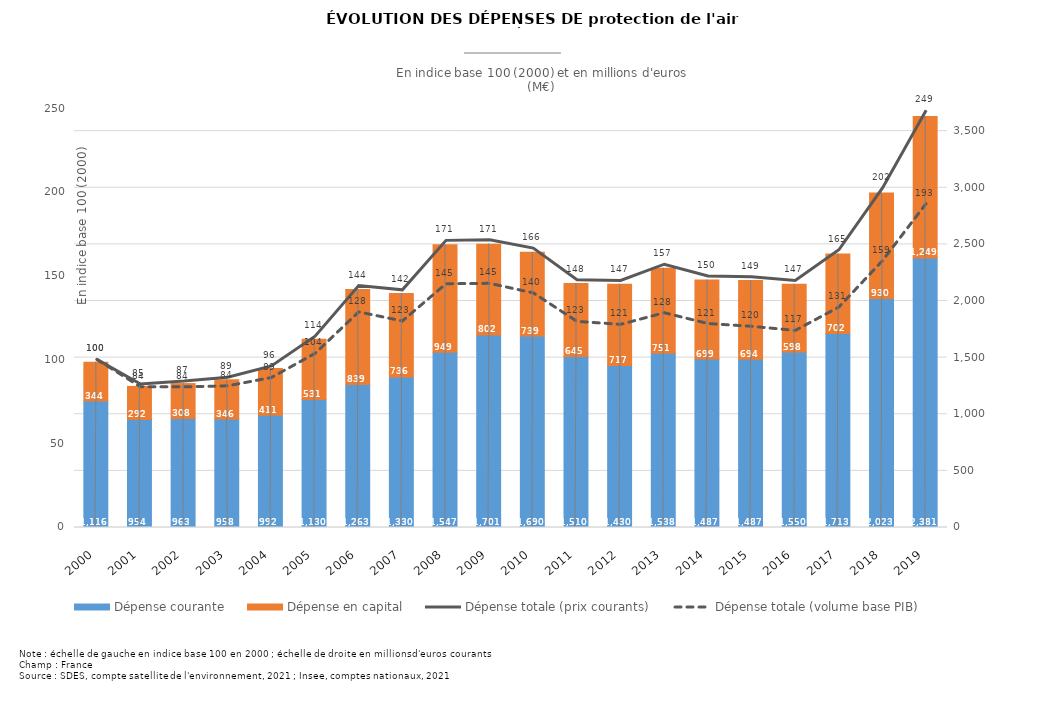
| Category | Dépense courante | Dépense en capital |
|---|---|---|
| 2000.0 | 1116.167 | 343.568 |
| 2001.0 | 953.949 | 292.072 |
| 2002.0 | 962.903 | 307.868 |
| 2003.0 | 957.936 | 346.267 |
| 2004.0 | 991.84 | 411.325 |
| 2005.0 | 1129.923 | 531.492 |
| 2006.0 | 1263.179 | 839.335 |
| 2007.0 | 1329.946 | 735.64 |
| 2008.0 | 1547.477 | 948.93 |
| 2009.0 | 1700.567 | 801.599 |
| 2010.0 | 1690.347 | 739.186 |
| 2011.0 | 1509.849 | 644.577 |
| 2012.0 | 1430.475 | 717.308 |
| 2013.0 | 1537.844 | 750.956 |
| 2014.0 | 1486.861 | 698.937 |
| 2015.0 | 1486.797 | 693.811 |
| 2016.0 | 1549.62 | 597.6 |
| 2017.0 | 1712.78 | 701.882 |
| 2018.0 | 2023.126 | 930.337 |
| 2019.0 | 2380.624 | 1248.584 |